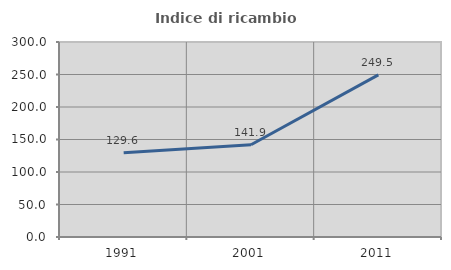
| Category | Indice di ricambio occupazionale  |
|---|---|
| 1991.0 | 129.605 |
| 2001.0 | 141.86 |
| 2011.0 | 249.485 |